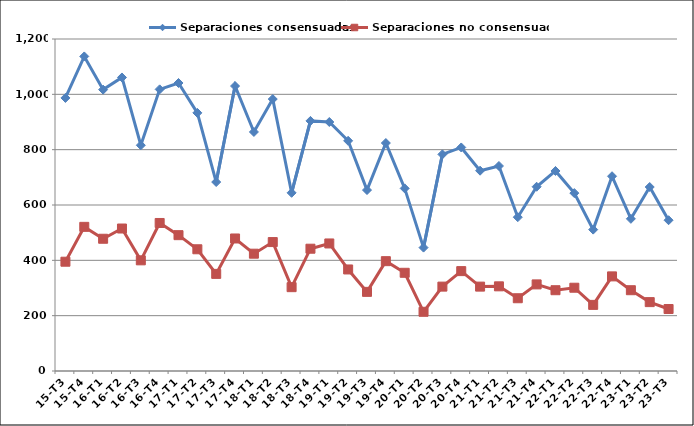
| Category | Separaciones consensuadas | Separaciones no consensuadas |
|---|---|---|
| 15-T3 | 987 | 395 |
| 15-T4 | 1137 | 521 |
| 16-T1 | 1017 | 478 |
| 16-T2 | 1061 | 515 |
| 16-T3 | 816 | 400 |
| 16-T4 | 1018 | 535 |
| 17-T1 | 1041 | 491 |
| 17-T2 | 933 | 440 |
| 17-T3 | 683 | 351 |
| 17-T4 | 1030 | 479 |
| 18-T1 | 864 | 424 |
| 18-T2 | 983 | 466 |
| 18-T3 | 644 | 303 |
| 18-T4 | 904 | 442 |
| 19-T1 | 900 | 461 |
| 19-T2 | 832 | 367 |
| 19-T3 | 654 | 286 |
| 19-T4 | 824 | 397 |
| 20-T1 | 660 | 355 |
| 20-T2 | 446 | 214 |
| 20-T3 | 783 | 305 |
| 20-T4 | 808 | 361 |
| 21-T1 | 724 | 305 |
| 21-T2 | 741 | 306 |
| 21-T3 | 556 | 263 |
| 21-T4 | 666 | 313 |
| 22-T1 | 723 | 292 |
| 22-T2 | 643 | 301 |
| 22-T3 | 511 | 239 |
| 22-T4 | 704 | 342 |
| 23-T1 | 550 | 292 |
| 23-T2 | 665 | 249 |
| 23-T3 | 545 | 224 |